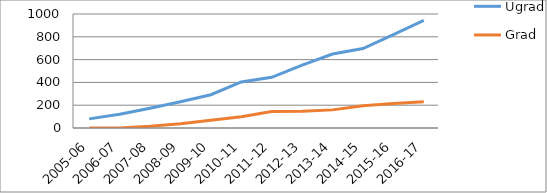
| Category | Ugrad | Grad |
|---|---|---|
| 2005-06 | 80 | 0 |
| 2006-07 | 120 | 0 |
| 2007-08 | 174 | 15 |
| 2008-09 | 230 | 38 |
| 2009-10 | 292 | 67 |
| 2010-11 | 404 | 99 |
| 2011-12 | 445 | 145 |
| 2012-13 | 551 | 146 |
| 2013-14 | 649 | 159 |
| 2014-15 | 697 | 196 |
| 2015-16 | 820 | 215 |
| 2016-17 | 944 | 230 |